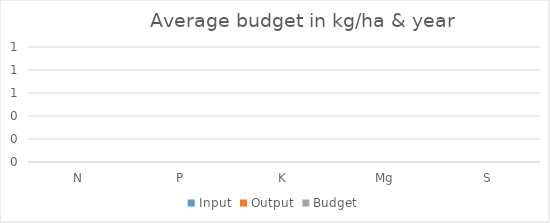
| Category | Input | Output | Budget |
|---|---|---|---|
| N | 0 | 0 | 0 |
| P | 0 | 0 | 0 |
| K | 0 | 0 | 0 |
| Mg | 0 | 0 | 0 |
| S | 0 | 0 | 0 |